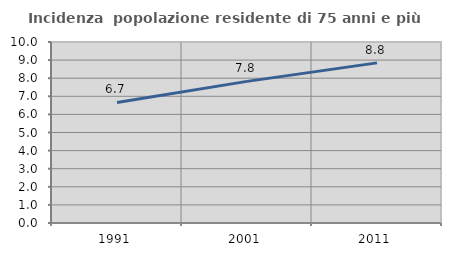
| Category | Incidenza  popolazione residente di 75 anni e più |
|---|---|
| 1991.0 | 6.659 |
| 2001.0 | 7.824 |
| 2011.0 | 8.847 |